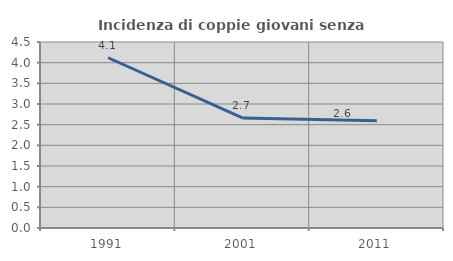
| Category | Incidenza di coppie giovani senza figli |
|---|---|
| 1991.0 | 4.119 |
| 2001.0 | 2.663 |
| 2011.0 | 2.597 |